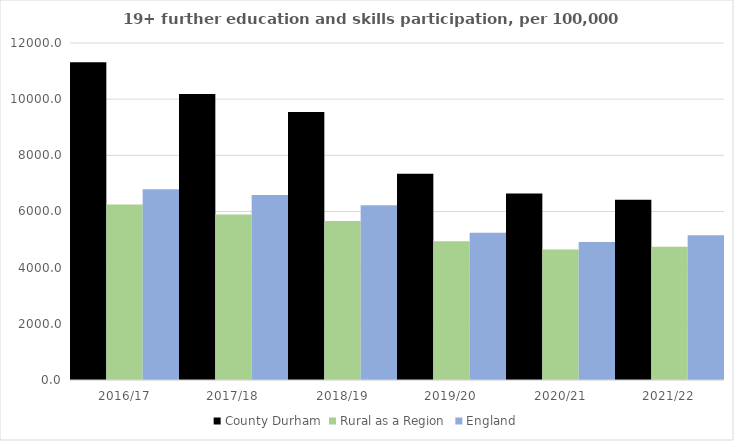
| Category | County Durham | Rural as a Region | England |
|---|---|---|---|
| 2016/17 | 11318 | 6253.401 | 6788 |
| 2017/18 | 10180 | 5892.029 | 6588 |
| 2018/19 | 9540 | 5661.873 | 6227 |
| 2019/20 | 7345 | 4943.801 | 5244 |
| 2020/21 | 6641 | 4646.727 | 4913 |
| 2021/22 | 6414 | 4747.049 | 5151 |